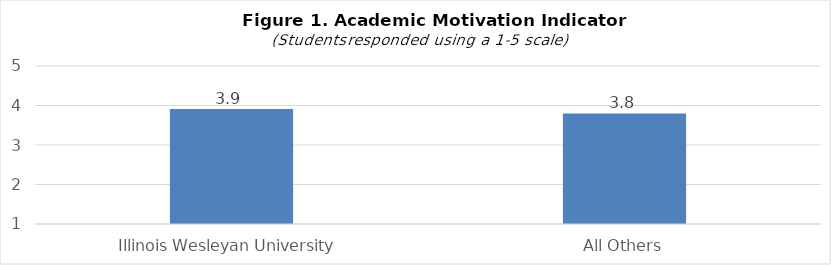
| Category | Series 0 |
|---|---|
| Illinois Wesleyan University | 3.91 |
| All Others | 3.8 |